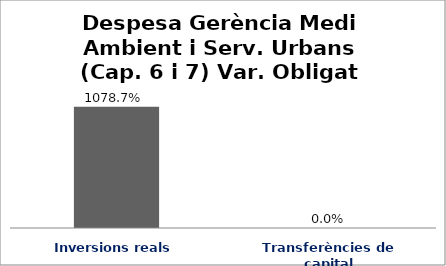
| Category | Series 0 |
|---|---|
| Inversions reals | 10.787 |
| Transferències de capital | 0 |